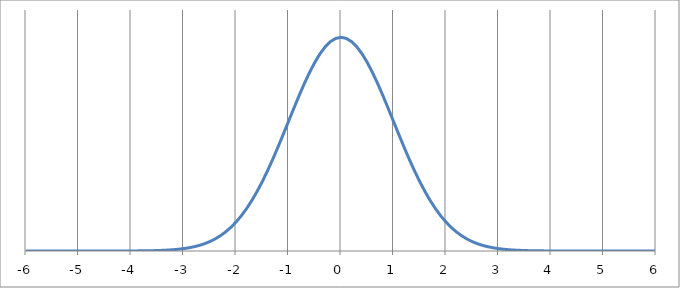
| Category | Series 0 |
|---|---|
| -6.0 | 0 |
| -5.9 | 0 |
| -5.8 | 0 |
| -5.7 | 0 |
| -5.6 | 0 |
| -5.5 | 0 |
| -5.4 | 0 |
| -5.3 | 0 |
| -5.2 | 0 |
| -5.1 | 0 |
| -5.0 | 0 |
| -4.9 | 0 |
| -4.8 | 0 |
| -4.7 | 0 |
| -4.6 | 0 |
| -4.5 | 0 |
| -4.4 | 0 |
| -4.3 | 0 |
| -4.2 | 0 |
| -4.1 | 0 |
| -4.0 | 0 |
| -3.9 | 0 |
| -3.8 | 0 |
| -3.7 | 0 |
| -3.6 | 0 |
| -3.5 | 0 |
| -3.4 | 0 |
| -3.3 | 0 |
| -3.2 | 0 |
| -3.1 | 0 |
| -3.0 | 0 |
| -2.9 | 0.001 |
| -2.8 | 0.001 |
| -2.7 | 0.001 |
| -2.6 | 0.001 |
| -2.5 | 0.002 |
| -2.4 | 0.002 |
| -2.3 | 0.003 |
| -2.2 | 0.004 |
| -2.1 | 0.004 |
| -2.0 | 0.005 |
| -1.9 | 0.007 |
| -1.8 | 0.008 |
| -1.7 | 0.009 |
| -1.6 | 0.011 |
| -1.5 | 0.013 |
| -1.4 | 0.015 |
| -1.3 | 0.017 |
| -1.2 | 0.019 |
| -1.1 | 0.022 |
| -1.0 | 0.024 |
| -0.9 | 0.027 |
| -0.8 | 0.029 |
| -0.7 | 0.031 |
| -0.6 | 0.033 |
| -0.5 | 0.035 |
| -0.4 | 0.037 |
| -0.3 | 0.038 |
| -0.2 | 0.039 |
| -0.1 | 0.04 |
| 0.0 | 0.04 |
| 0.1 | 0.04 |
| 0.2 | 0.039 |
| 0.3 | 0.038 |
| 0.4 | 0.037 |
| 0.5 | 0.035 |
| 0.6 | 0.033 |
| 0.7 | 0.031 |
| 0.8 | 0.029 |
| 0.9 | 0.027 |
| 1.0 | 0.024 |
| 1.1 | 0.022 |
| 1.2 | 0.019 |
| 1.3 | 0.017 |
| 1.4 | 0.015 |
| 1.5 | 0.013 |
| 1.6 | 0.011 |
| 1.7 | 0.009 |
| 1.8 | 0.008 |
| 1.9 | 0.007 |
| 2.0 | 0.005 |
| 2.1 | 0.004 |
| 2.2 | 0.004 |
| 2.3 | 0.003 |
| 2.4 | 0.002 |
| 2.5 | 0.002 |
| 2.6 | 0.001 |
| 2.7 | 0.001 |
| 2.8 | 0.001 |
| 2.9 | 0.001 |
| 3.0 | 0 |
| 3.1 | 0 |
| 3.2 | 0 |
| 3.3 | 0 |
| 3.4 | 0 |
| 3.5 | 0 |
| 3.6 | 0 |
| 3.7 | 0 |
| 3.8 | 0 |
| 3.9 | 0 |
| 4.0 | 0 |
| 4.1 | 0 |
| 4.2 | 0 |
| 4.3 | 0 |
| 4.4 | 0 |
| 4.5 | 0 |
| 4.6 | 0 |
| 4.7 | 0 |
| 4.8 | 0 |
| 4.9 | 0 |
| 5.0 | 0 |
| 5.1 | 0 |
| 5.2 | 0 |
| 5.3 | 0 |
| 5.4 | 0 |
| 5.5 | 0 |
| 5.6 | 0 |
| 5.7 | 0 |
| 5.8 | 0 |
| 5.9 | 0 |
| 6.0 | 0 |